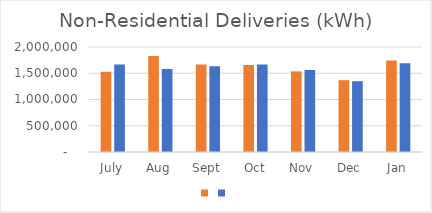
| Category | Series 1 | Series 0 |
|---|---|---|
| July | 1527956 | 1664865 |
| Aug | 1829758 | 1582276 |
| Sept | 1665239 | 1633351 |
| Oct | 1657467 | 1665276 |
| Nov | 1535448 | 1561812 |
| Dec | 1367905 | 1348000 |
| Jan | 1741151 | 1691318 |